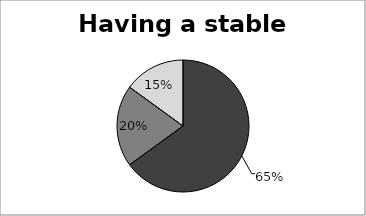
| Category | Having a stable job |
|---|---|
| 0 | 0.65 |
| 1 | 0.2 |
| 2 | 0.15 |